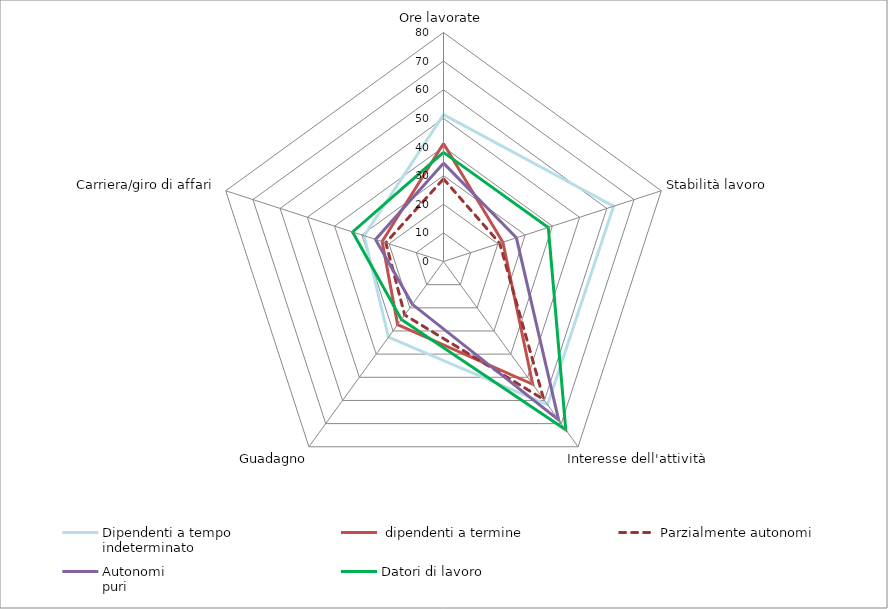
| Category | Dipendenti a tempo
indeterminato |  dipendenti a termine | Parzialmente autonomi | Autonomi
puri | Datori di lavoro |
|---|---|---|---|---|---|
| Ore lavorate | 51.311 | 41.243 | 28.854 | 34.36 | 38.116 |
| Stabilità lavoro | 62.494 | 21.816 | 20.643 | 26.773 | 38.497 |
| Interesse dell'attività | 61.861 | 53.022 | 59.583 | 68.425 | 72.663 |
| Guadagno | 32.709 | 27.256 | 23.068 | 18.491 | 25.033 |
| Carriera/giro di affari | 29.139 | 22.528 | 21.183 | 24.974 | 33.39 |